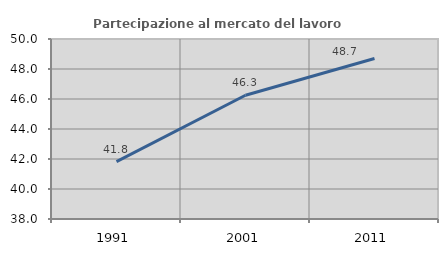
| Category | Partecipazione al mercato del lavoro  femminile |
|---|---|
| 1991.0 | 41.824 |
| 2001.0 | 46.251 |
| 2011.0 | 48.703 |